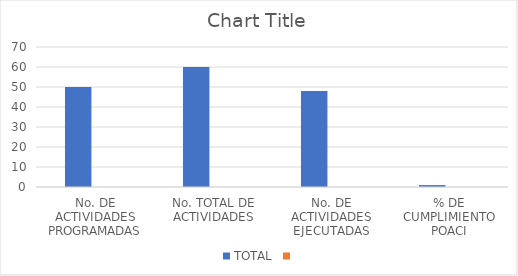
| Category | TOTAL | Series 1 |
|---|---|---|
| No. DE ACTIVIDADES PROGRAMADAS | 50 |  |
| No. TOTAL DE ACTIVIDADES | 60 |  |
| No. DE ACTIVIDADES EJECUTADAS | 48 |  |
| % DE CUMPLIMIENTO POACI | 0.96 |  |